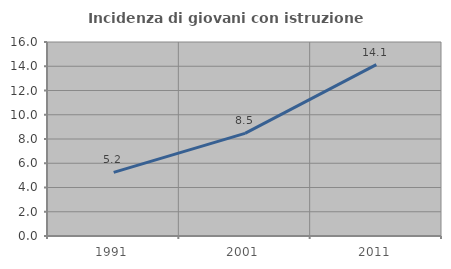
| Category | Incidenza di giovani con istruzione universitaria |
|---|---|
| 1991.0 | 5.249 |
| 2001.0 | 8.462 |
| 2011.0 | 14.13 |